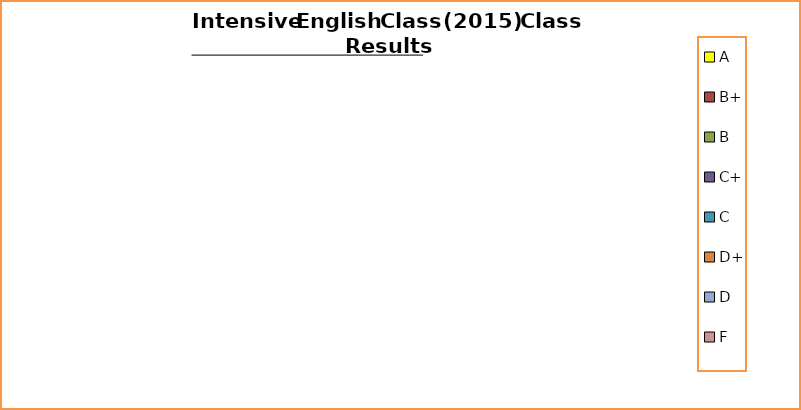
| Category | Series 0 |
|---|---|
| A | 0 |
| B+ | 0 |
| B | 0 |
| C+ | 0 |
| C | 0 |
| D+ | 0 |
| D | 0 |
| F | 0 |